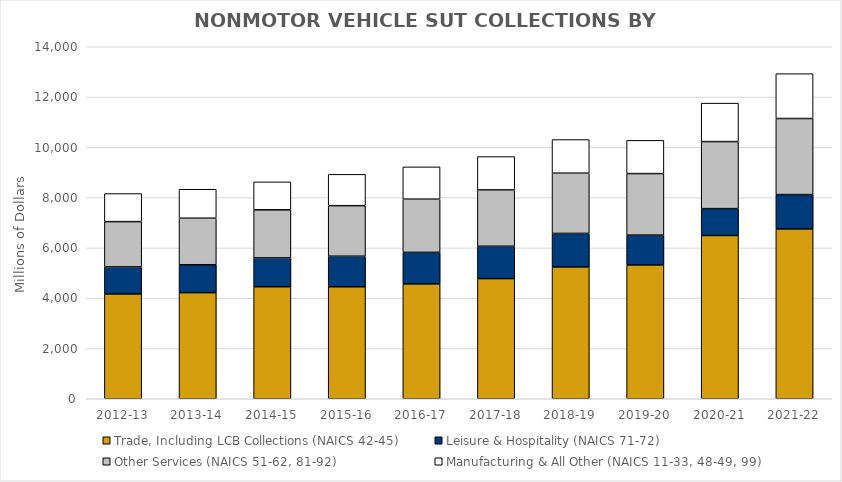
| Category | Trade, Including LCB Collections (NAICS 42-45) | Leisure & Hospitality (NAICS 71-72) | Other Services (NAICS 51-62, 81-92)  | Manufacturing & All Other (NAICS 11-33, 48-49, 99) |
|---|---|---|---|---|
| 2012-13 | 4168.645 | 1075.752 | 1800.929 | 1116.48 |
| 2013-14 | 4220.417 | 1109.283 | 1850.888 | 1152.688 |
| 2014-15 | 4455.981 | 1146.553 | 1911.478 | 1112.274 |
| 2015-16 | 4453.51 | 1215.98 | 2010.019 | 1246.313 |
| 2016-17 | 4568.4 | 1253.826 | 2116.248 | 1283.725 |
| 2017-18 | 4778.546 | 1286.949 | 2239.731 | 1326.886 |
| 2018-19 | 5243.307 | 1333.348 | 2395.041 | 1337.503 |
| 2019-20 | 5323.282 | 1185.003 | 2447.845 | 1321.36 |
| 2020-21 | 6494.009 | 1067.738 | 2666.817 | 1529.241 |
| 2021-22 | 6754.267 | 1366.04 | 3025.041 | 1784.474 |